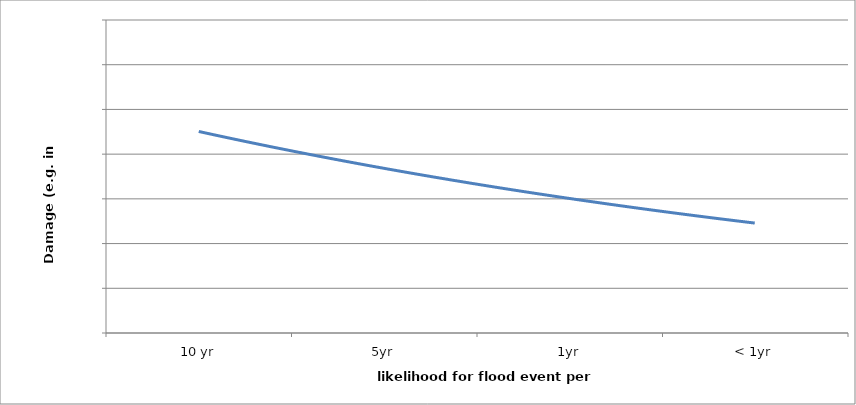
| Category | Series 0 |
|---|---|
| 10 yr | 0.063 |
| 5yr | 0.027 |
| 1yr | 0.021 |
| < 1yr | 0.035 |